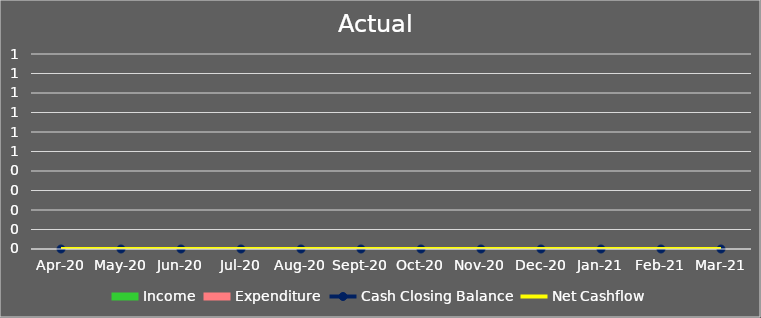
| Category | Income | Expenditure |
|---|---|---|
| 2020-04-01 | 0 | 0 |
| 2020-05-01 | 0 | 0 |
| 2020-06-01 | 0 | 0 |
| 2020-07-01 | 0 | 0 |
| 2020-08-01 | 0 | 0 |
| 2020-09-01 | 0 | 0 |
| 2020-10-01 | 0 | 0 |
| 2020-11-01 | 0 | 0 |
| 2020-12-01 | 0 | 0 |
| 2021-01-01 | 0 | 0 |
| 2021-02-01 | 0 | 0 |
| 2021-03-01 | 0 | 0 |